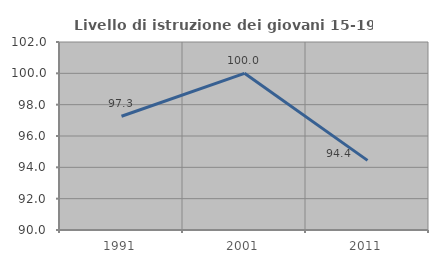
| Category | Livello di istruzione dei giovani 15-19 anni |
|---|---|
| 1991.0 | 97.26 |
| 2001.0 | 100 |
| 2011.0 | 94.444 |